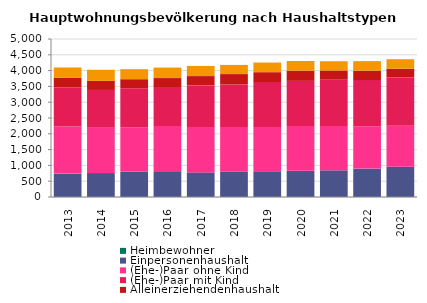
| Category | Heimbewohner | Einpersonenhaushalt | (Ehe-)Paar ohne Kind | (Ehe-)Paar mit Kind | Alleinerziehendenhaushalt | sonstiger Mehrpersonenhaushalt |
|---|---|---|---|---|---|---|
| 2013.0 | 0 | 740 | 1493 | 1232 | 305 | 329 |
| 2014.0 | 0 | 758 | 1430 | 1199 | 287 | 353 |
| 2015.0 | 0 | 797 | 1412 | 1232 | 287 | 317 |
| 2016.0 | 0 | 791 | 1457 | 1205 | 311 | 332 |
| 2017.0 | 0 | 779 | 1439 | 1313 | 296 | 320 |
| 2018.0 | 0 | 803 | 1412 | 1346 | 329 | 290 |
| 2019.0 | 0 | 815 | 1403 | 1418 | 314 | 305 |
| 2020.0 | 0 | 830 | 1415 | 1430 | 323 | 305 |
| 2021.0 | 0 | 845 | 1403 | 1463 | 293 | 293 |
| 2022.0 | 0 | 899 | 1340 | 1460 | 296 | 305 |
| 2023.0 | 0 | 959 | 1295 | 1529 | 278 | 299 |